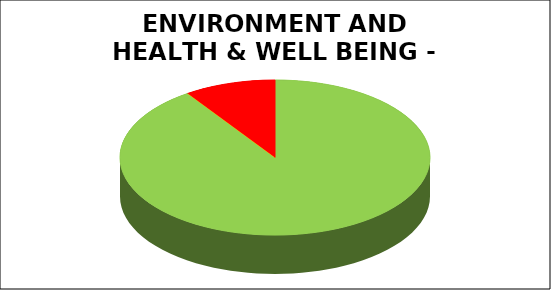
| Category | Series 0 |
|---|---|
| Green | 0.905 |
| Amber | 0 |
| Red | 0.095 |